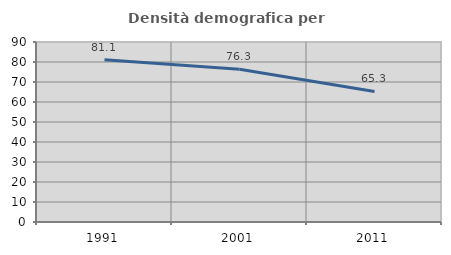
| Category | Densità demografica |
|---|---|
| 1991.0 | 81.072 |
| 2001.0 | 76.349 |
| 2011.0 | 65.284 |